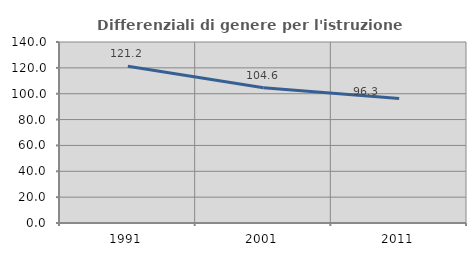
| Category | Differenziali di genere per l'istruzione superiore |
|---|---|
| 1991.0 | 121.184 |
| 2001.0 | 104.618 |
| 2011.0 | 96.25 |